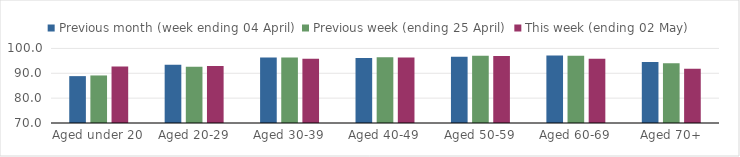
| Category | Previous month (week ending 04 April) | Previous week (ending 25 April) | This week (ending 02 May) |
|---|---|---|---|
| Aged under 20 | 88.858 | 89.123 | 92.71 |
| Aged 20-29 | 93.419 | 92.668 | 92.893 |
| Aged 30-39 | 96.332 | 96.332 | 95.864 |
| Aged 40-49 | 96.189 | 96.462 | 96.362 |
| Aged 50-59 | 96.643 | 97.037 | 96.904 |
| Aged 60-69 | 97.187 | 97.007 | 95.886 |
| Aged 70+ | 94.498 | 94.058 | 91.829 |